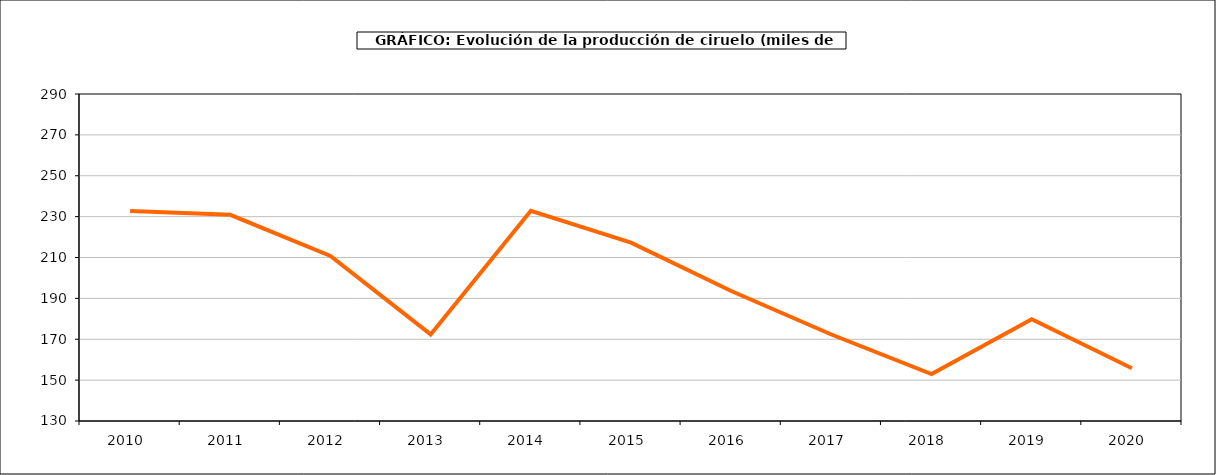
| Category | producción Ciruelo |
|---|---|
| 2010.0 | 232.78 |
| 2011.0 | 230.877 |
| 2012.0 | 210.726 |
| 2013.0 | 172.352 |
| 2014.0 | 232.831 |
| 2015.0 | 217.291 |
| 2016.0 | 193.598 |
| 2017.0 | 172.325 |
| 2018.0 | 152.984 |
| 2019.0 | 179.839 |
| 2020.0 | 155.834 |